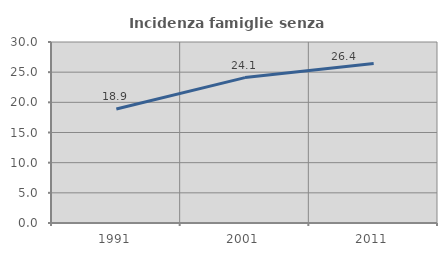
| Category | Incidenza famiglie senza nuclei |
|---|---|
| 1991.0 | 18.894 |
| 2001.0 | 24.101 |
| 2011.0 | 26.42 |